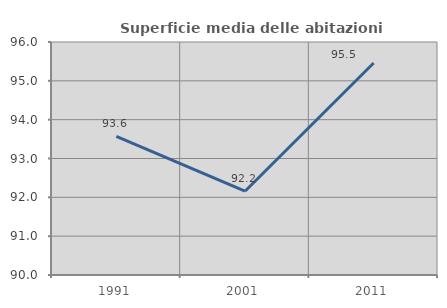
| Category | Superficie media delle abitazioni occupate |
|---|---|
| 1991.0 | 93.57 |
| 2001.0 | 92.157 |
| 2011.0 | 95.461 |